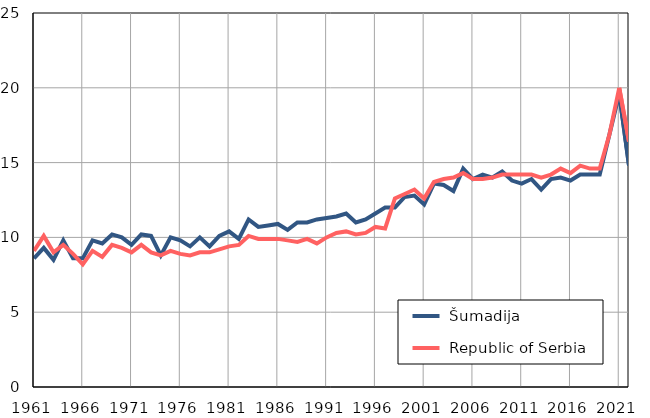
| Category |  Šumadija |  Republic of Serbia |
|---|---|---|
| 1961.0 | 8.6 | 9.1 |
| 1962.0 | 9.3 | 10.1 |
| 1963.0 | 8.5 | 9 |
| 1964.0 | 9.8 | 9.5 |
| 1965.0 | 8.6 | 8.9 |
| 1966.0 | 8.6 | 8.2 |
| 1967.0 | 9.8 | 9.1 |
| 1968.0 | 9.6 | 8.7 |
| 1969.0 | 10.2 | 9.5 |
| 1970.0 | 10 | 9.3 |
| 1971.0 | 9.5 | 9 |
| 1972.0 | 10.2 | 9.5 |
| 1973.0 | 10.1 | 9 |
| 1974.0 | 8.8 | 8.8 |
| 1975.0 | 10 | 9.1 |
| 1976.0 | 9.8 | 8.9 |
| 1977.0 | 9.4 | 8.8 |
| 1978.0 | 10 | 9 |
| 1979.0 | 9.4 | 9 |
| 1980.0 | 10.1 | 9.2 |
| 1981.0 | 10.4 | 9.4 |
| 1982.0 | 9.9 | 9.5 |
| 1983.0 | 11.2 | 10.1 |
| 1984.0 | 10.7 | 9.9 |
| 1985.0 | 10.8 | 9.9 |
| 1986.0 | 10.9 | 9.9 |
| 1987.0 | 10.5 | 9.8 |
| 1988.0 | 11 | 9.7 |
| 1989.0 | 11 | 9.9 |
| 1990.0 | 11.2 | 9.6 |
| 1991.0 | 11.3 | 10 |
| 1992.0 | 11.4 | 10.3 |
| 1993.0 | 11.6 | 10.4 |
| 1994.0 | 11 | 10.2 |
| 1995.0 | 11.2 | 10.3 |
| 1996.0 | 11.6 | 10.7 |
| 1997.0 | 12 | 10.6 |
| 1998.0 | 12 | 12.6 |
| 1999.0 | 12.7 | 12.9 |
| 2000.0 | 12.8 | 13.2 |
| 2001.0 | 12.2 | 12.6 |
| 2002.0 | 13.6 | 13.7 |
| 2003.0 | 13.5 | 13.9 |
| 2004.0 | 13.1 | 14 |
| 2005.0 | 14.6 | 14.3 |
| 2006.0 | 13.9 | 13.9 |
| 2007.0 | 14.2 | 13.9 |
| 2008.0 | 14 | 14 |
| 2009.0 | 14.4 | 14.2 |
| 2010.0 | 13.8 | 14.2 |
| 2011.0 | 13.6 | 14.2 |
| 2012.0 | 13.9 | 14.2 |
| 2013.0 | 13.2 | 14 |
| 2014.0 | 13.9 | 14.2 |
| 2015.0 | 14 | 14.6 |
| 2016.0 | 13.8 | 14.3 |
| 2017.0 | 14.2 | 14.8 |
| 2018.0 | 14.2 | 14.6 |
| 2019.0 | 14.2 | 14.6 |
| 2020.0 | 16.9 | 16.9 |
| 2021.0 | 19.6 | 20 |
| 2022.0 | 14.8 | 16.4 |